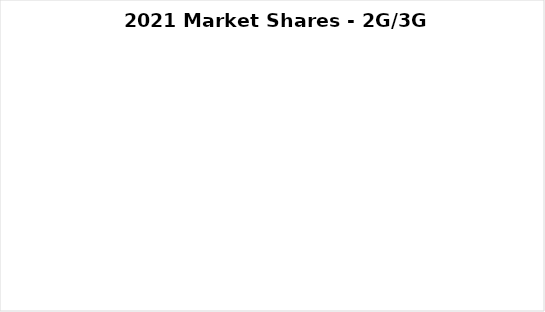
| Category | 2021 |
|---|---|
| Ericsson | 0 |
| Fujitsu | 0 |
| HPE | 0 |
| Huawei | 0 |
| Nokia | 0 |
| Samsung | 0 |
| ZTE | 0 |
| Other | 0 |